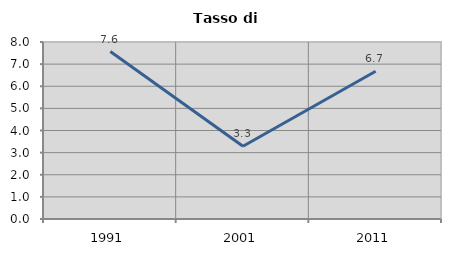
| Category | Tasso di disoccupazione   |
|---|---|
| 1991.0 | 7.57 |
| 2001.0 | 3.286 |
| 2011.0 | 6.676 |